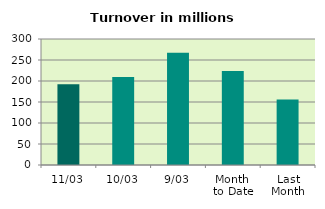
| Category | Series 0 |
|---|---|
| 11/03 | 192.462 |
| 10/03 | 209.82 |
| 9/03 | 267.13 |
| Month 
to Date | 223.576 |
| Last
Month | 156.222 |